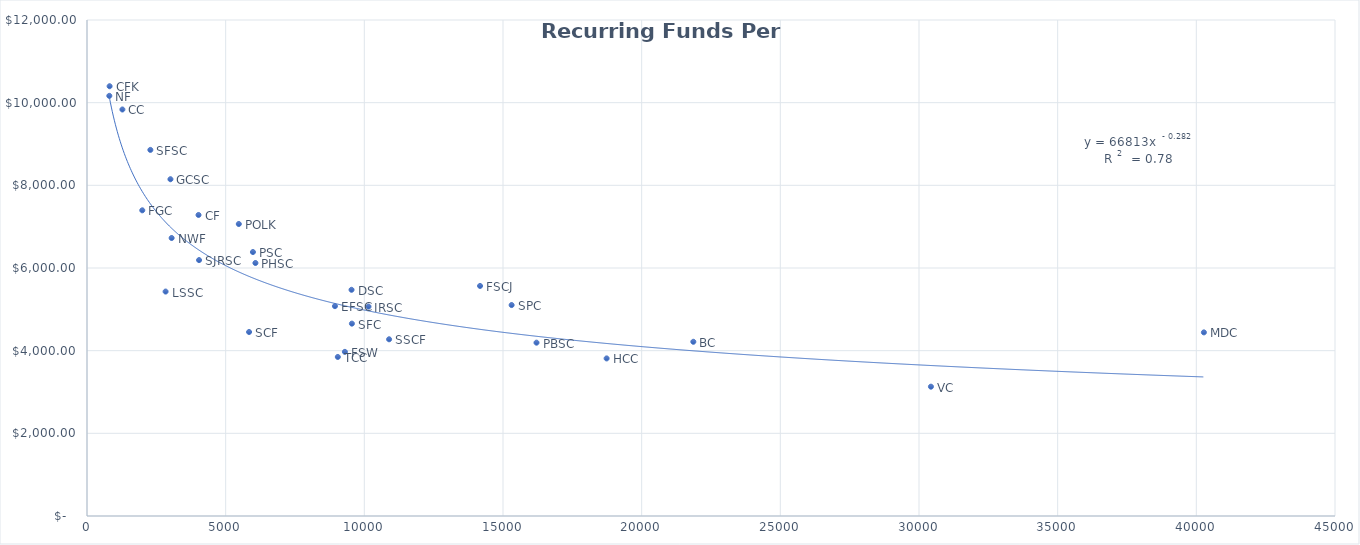
| Category | Funds Per FTE  |
|---|---|
| 804.9 | 10164.76 |
| 815.1 | 10397.322 |
| 1276.4 | 9834.755 |
| 1993.2 | 7395.361 |
| 2284.9 | 8856.75 |
| 2834.2 | 5429.841 |
| 3009.0 | 8147.407 |
| 3051.9 | 6725.348 |
| 4021.1 | 7282.829 |
| 4040.3 | 6191.006 |
| 5473.6 | 7064.289 |
| 5844.3 | 4451.287 |
| 5983.3 | 6385.962 |
| 6073.3 | 6120.786 |
| 8940.3 | 5077.299 |
| 9043.7 | 3847.54 |
| 9298.5 | 3970.692 |
| 9538.7 | 5472.578 |
| 9551.9 | 4653.797 |
| 10150.0 | 5066.303 |
| 10892.9 | 4275.348 |
| 14172.4 | 5565.514 |
| 15311.3 | 5103.217 |
| 16208.1 | 4193.367 |
| 18736.5 | 3812.268 |
| 21862.8 | 4214.717 |
| 30430.4 | 3128.495 |
| 40272.8 | 4442.352 |